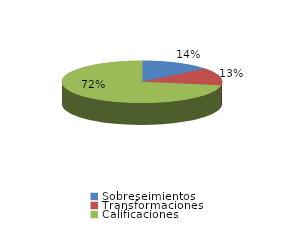
| Category | Series 0 |
|---|---|
| Sobreseimientos | 136 |
| Transformaciones | 127 |
| Calificaciones | 689 |